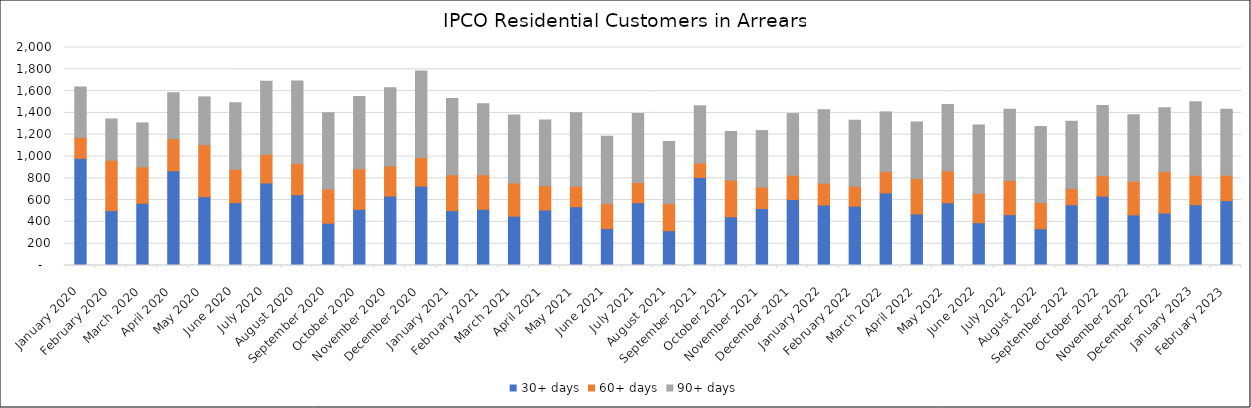
| Category | 30+ days | 60+ days | 90+ days |
|---|---|---|---|
| 2020-01-01 | 983 | 192 | 463 |
| 2020-02-01 | 503 | 463 | 378 |
| 2020-03-01 | 571 | 334 | 403 |
| 2020-04-01 | 869 | 294 | 422 |
| 2020-05-01 | 632 | 477 | 438 |
| 2020-06-01 | 577 | 307 | 609 |
| 2020-07-01 | 757 | 263 | 670 |
| 2020-08-01 | 650 | 286 | 756 |
| 2020-09-01 | 388 | 313 | 701 |
| 2020-10-01 | 515 | 372 | 664 |
| 2020-11-01 | 637 | 276 | 718 |
| 2020-12-01 | 728 | 262 | 794 |
| 2021-01-01 | 504 | 329 | 700 |
| 2021-02-01 | 516 | 316 | 653 |
| 2021-03-01 | 453 | 305 | 623 |
| 2021-04-01 | 509 | 222 | 604 |
| 2021-05-01 | 539 | 188 | 675 |
| 2021-06-01 | 339 | 228 | 618 |
| 2021-07-01 | 576 | 186 | 632 |
| 2021-08-01 | 319 | 248 | 571 |
| 2021-09-01 | 808 | 132 | 525 |
| 2021-10-01 | 447 | 336 | 447 |
| 2021-11-01 | 523 | 196 | 519 |
| 2021-12-01 | 605 | 223 | 566 |
| 2022-01-01 | 554 | 200 | 674 |
| 2022-02-01 | 544 | 183 | 605 |
| 2022-03-01 | 666 | 196 | 547 |
| 2022-04-01 | 473 | 324 | 520 |
| 2022-05-01 | 575 | 292 | 610 |
| 2022-06-01 | 392 | 270 | 627 |
| 2022-07-01 | 466 | 314 | 653 |
| 2022-08-01 | 337 | 241 | 697 |
| 2022-09-01 | 557 | 150 | 617 |
| 2022-10-01 | 637 | 187 | 644 |
| 2022-11-01 | 464 | 310 | 608 |
| 2022-12-01 | 481 | 378 | 588 |
| 2023-01-01 | 558 | 271 | 673 |
| 2023-02-01 | 595 | 233 | 605 |